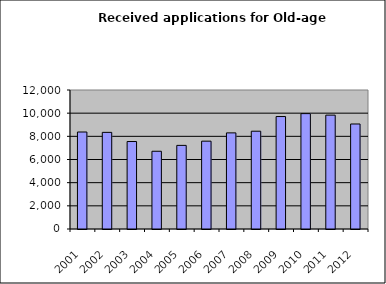
| Category | Series 1 |
|---|---|
| 2001.0 | 8373 |
| 2002.0 | 8343 |
| 2003.0 | 7552 |
| 2004.0 | 6712 |
| 2005.0 | 7219 |
| 2006.0 | 7583 |
| 2007.0 | 8298 |
| 2008.0 | 8442 |
| 2009.0 | 9709 |
| 2010.0 | 9961 |
| 2011.0 | 9830 |
| 2012.0 | 9066 |